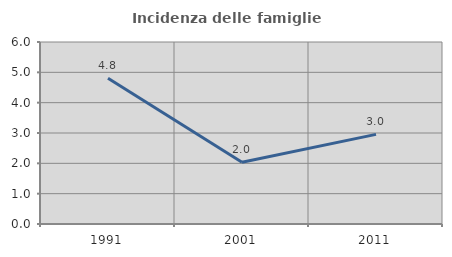
| Category | Incidenza delle famiglie numerose |
|---|---|
| 1991.0 | 4.805 |
| 2001.0 | 2.037 |
| 2011.0 | 2.955 |